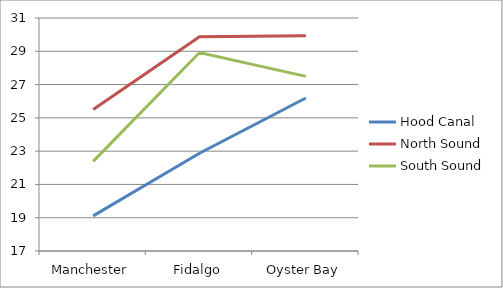
| Category | Hood Canal | North Sound | South Sound |
|---|---|---|---|
| Manchester | 19.111 | 25.5 | 22.385 |
| Fidalgo | 22.875 | 29.875 | 28.923 |
| Oyster Bay | 26.192 | 29.933 | 27.493 |